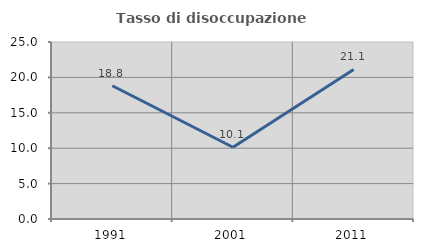
| Category | Tasso di disoccupazione giovanile  |
|---|---|
| 1991.0 | 18.815 |
| 2001.0 | 10.134 |
| 2011.0 | 21.117 |